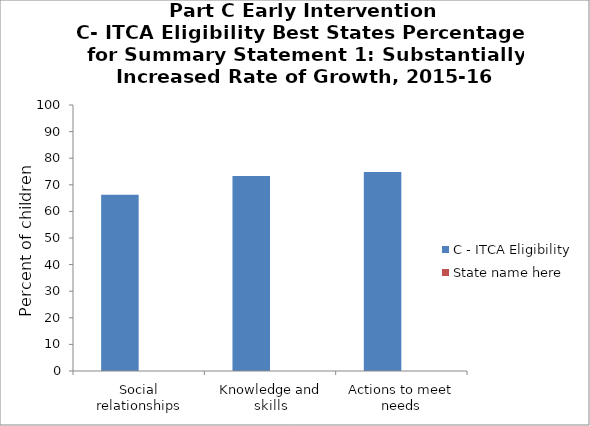
| Category | C - ITCA Eligibility | State name here |
|---|---|---|
| Social relationships | 66.3 |  |
| Knowledge and skills | 73.3 |  |
| Actions to meet needs | 74.8 |  |